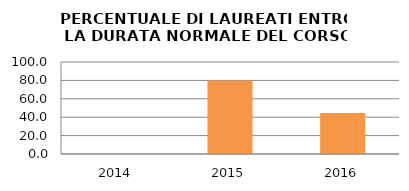
| Category | 2014 2015 2016 |
|---|---|
| 2014.0 | 0 |
| 2015.0 | 80 |
| 2016.0 | 44.444 |